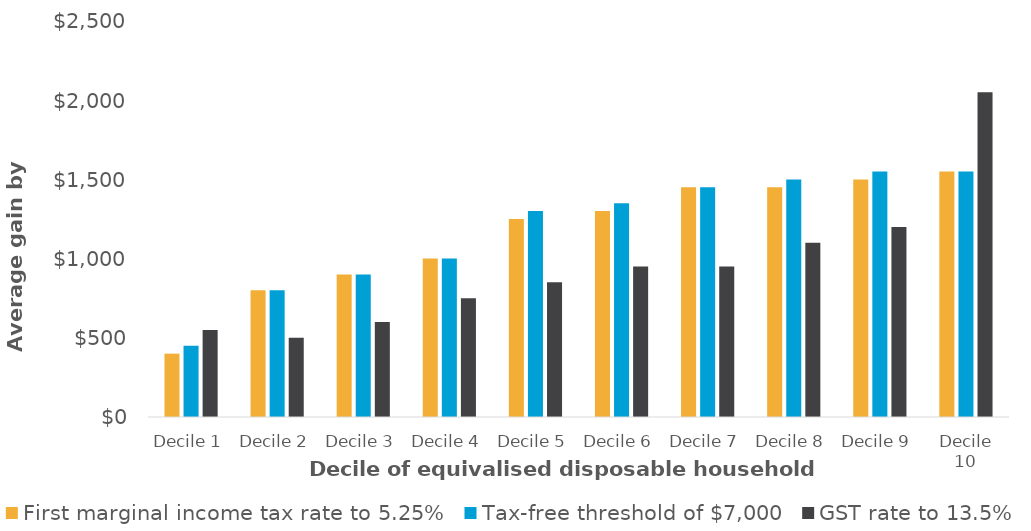
| Category | First marginal income tax rate to 5.25% | Tax-free threshold of $7,000 | GST rate to 13.5% |
|---|---|---|---|
| Decile 1 | 400 | 450 | 550 |
| Decile 2 | 800 | 800 | 500 |
| Decile 3 | 900 | 900 | 600 |
| Decile 4 | 1000 | 1000 | 750 |
| Decile 5 | 1250 | 1300 | 850 |
| Decile 6 | 1300 | 1350 | 950 |
| Decile 7 | 1450 | 1450 | 950 |
| Decile 8 | 1450 | 1500 | 1100 |
| Decile 9 | 1500 | 1550 | 1200 |
| Decile 10 | 1550 | 1550 | 2050 |